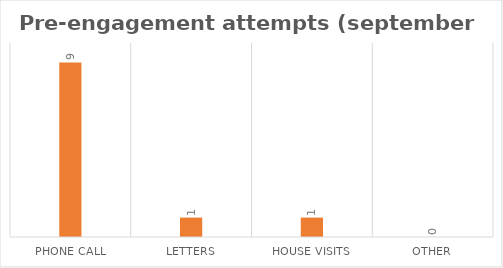
| Category | Series 0 |
|---|---|
| Phone call | 9 |
| Letters | 1 |
| House Visits | 1 |
| Other | 0 |